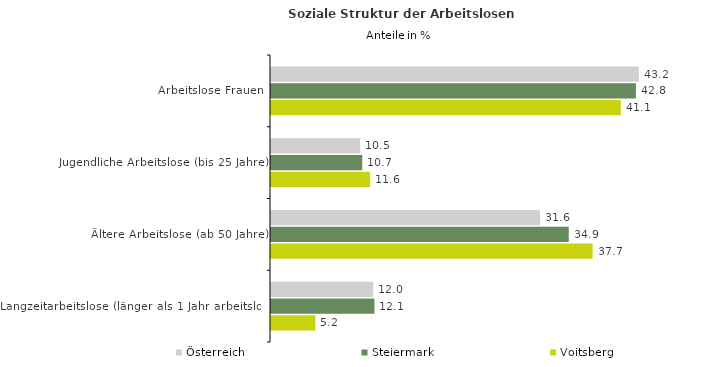
| Category | Österreich | Steiermark | Voitsberg |
|---|---|---|---|
| Arbeitslose Frauen | 43.18 | 42.833 | 41.06 |
| Jugendliche Arbeitslose (bis 25 Jahre) | 10.46 | 10.711 | 11.637 |
| Ältere Arbeitslose (ab 50 Jahre) | 31.584 | 34.947 | 37.748 |
| Langzeitarbeitslose (länger als 1 Jahr arbeitslos) | 11.999 | 12.142 | 5.203 |